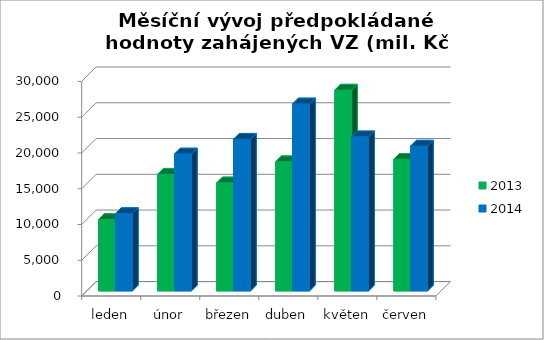
| Category | 2013 | 2014 |
|---|---|---|
| leden | 9973.711 | 10804.109 |
| únor | 16314.084 | 19139.794 |
| březen | 15102.671 | 21202.19 |
| duben | 18065.736 | 26142.744 |
| květen | 28072.841 | 21538.534 |
| červen | 18402.094 | 20248.533 |